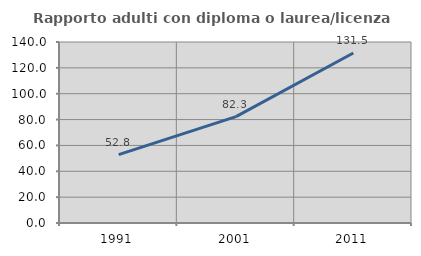
| Category | Rapporto adulti con diploma o laurea/licenza media  |
|---|---|
| 1991.0 | 52.833 |
| 2001.0 | 82.311 |
| 2011.0 | 131.469 |